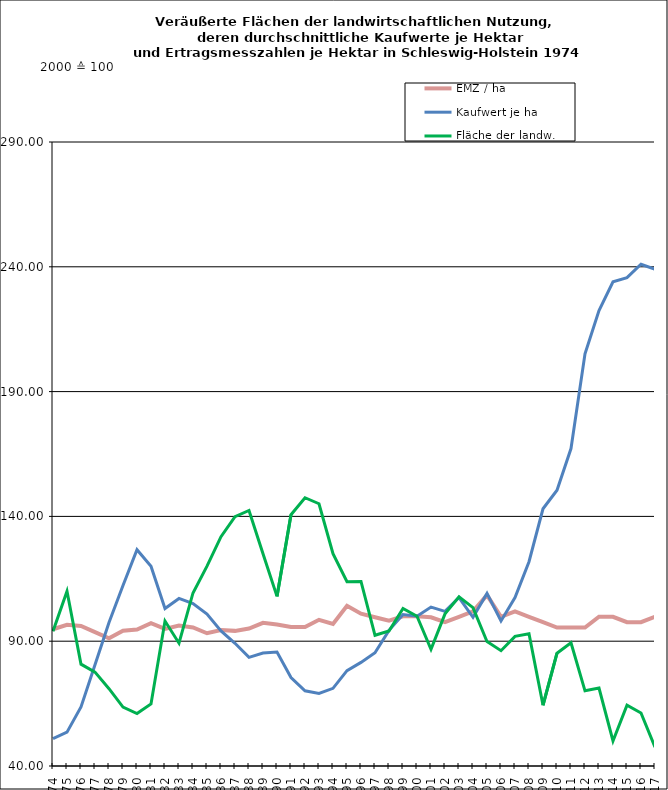
| Category | EMZ / ha | Kaufwert je ha | Fläche der landw. Nutzung |
|---|---|---|---|
| 1974.0 | 94.795 | 51 | 93.981 |
| 1975.0 | 96.597 | 53.545 | 110.037 |
| 1976.0 | 96.097 | 63.639 | 80.798 |
| 1977.0 | 93.651 | 80.567 | 77.6 |
| 1978.0 | 91.177 | 97.503 | 70.981 |
| 1979.0 | 94.169 | 112.291 | 63.587 |
| 1980.0 | 94.702 | 126.649 | 61.017 |
| 1981.0 | 97.202 | 120.065 | 64.89 |
| 1982.0 | 94.914 | 103.096 | 98.077 |
| 1983.0 | 96.246 | 107.125 | 89.198 |
| 1984.0 | 95.527 | 105.048 | 109.324 |
| 1985.0 | 93.182 | 100.843 | 120.09 |
| 1986.0 | 94.48 | 94.135 | 131.88 |
| 1987.0 | 94.141 | 89.159 | 139.897 |
| 1988.0 | 95.081 | 83.528 | 142.385 |
| 1989.0 | 97.343 | 85.246 | 125.065 |
| 1990.0 | 96.683 | 85.684 | 107.96 |
| 1991.0 | 95.675 | 75.423 | 140.67 |
| 1992.0 | 95.651 | 70.143 | 147.485 |
| 1993.0 | 98.57 | 69.101 | 145.071 |
| 1994.0 | 96.941 | 71.113 | 125.075 |
| 1995.0 | 104.16 | 78.2 | 113.839 |
| 1996.0 | 101.007 | 81.509 | 113.945 |
| 1997.0 | 99.604 | 85.367 | 92.368 |
| 1998.0 | 98.258 | 94.343 | 94.074 |
| 1999.0 | 99.97 | 100.651 | 103.111 |
| 2000.0 | 100 | 100 | 100 |
| 2001.0 | 99.588 | 103.657 | 86.753 |
| 2002.0 | 97.614 | 101.94 | 100.958 |
| 2003.0 | 99.783 | 107.499 | 107.763 |
| 2004.0 | 101.952 | 99.575 | 103.431 |
| 2005.0 | 108.46 | 109.153 | 89.843 |
| 2006.0 | 99.783 | 98.107 | 86.202 |
| 2007.0 | 101.952 | 107.508 | 91.94 |
| 2008.0 | 99.783 | 121.845 | 93.002 |
| 2009.0 | 97.614 | 143.056 | 64.336 |
| 2010.0 | 95.445 | 150.509 | 85.196 |
| 2011.0 | 95.445 | 167.176 | 89.386 |
| 2012.0 | 95.445 | 205.117 | 70.111 |
| 2013.0 | 99.783 | 222.46 | 71.215 |
| 2014.0 | 99.783 | 234.004 | 50.013 |
| 2015.0 | 97.614 | 235.632 | 64.355 |
| 2016.0 | 97.614 | 241.03 | 61.26 |
| 2017.0 | 99.783 | 239.02 | 47.529 |